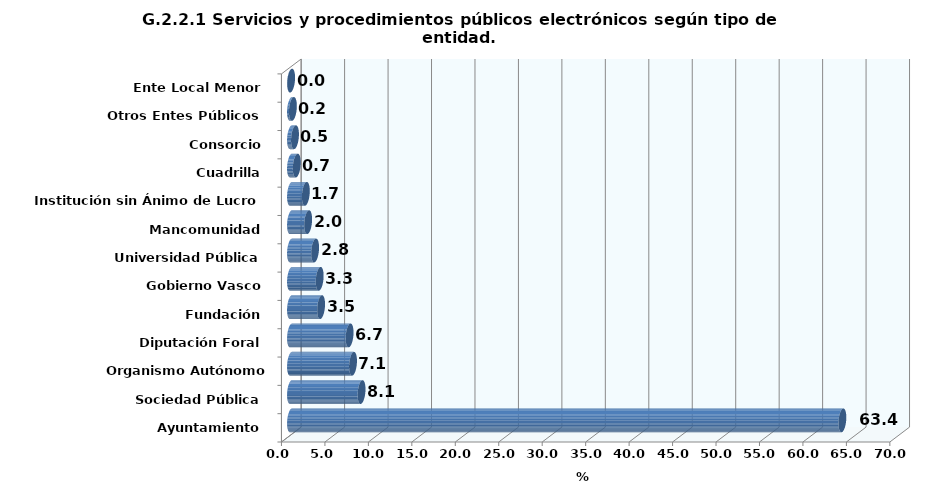
| Category | 2021 |
|---|---|
| Ayuntamiento | 63.441 |
| Sociedad Pública | 8.118 |
| Organismo Autónomo Administrativo | 7.137 |
| Diputación Foral | 6.741 |
| Fundación | 3.462 |
| Gobierno Vasco | 3.3 |
| Universidad Pública | 2.774 |
| Mancomunidad | 1.973 |
| Institución sin Ánimo de Lucro | 1.709 |
| Cuadrilla | 0.665 |
| Consorcio | 0.461 |
| Otros Entes Públicos | 0.219 |
| Ente Local Menor | 0.015 |